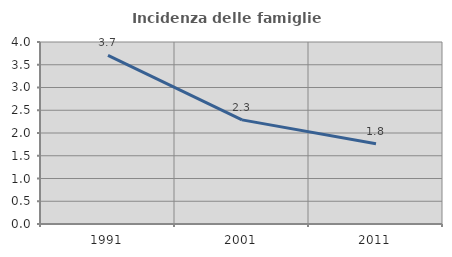
| Category | Incidenza delle famiglie numerose |
|---|---|
| 1991.0 | 3.706 |
| 2001.0 | 2.289 |
| 2011.0 | 1.763 |